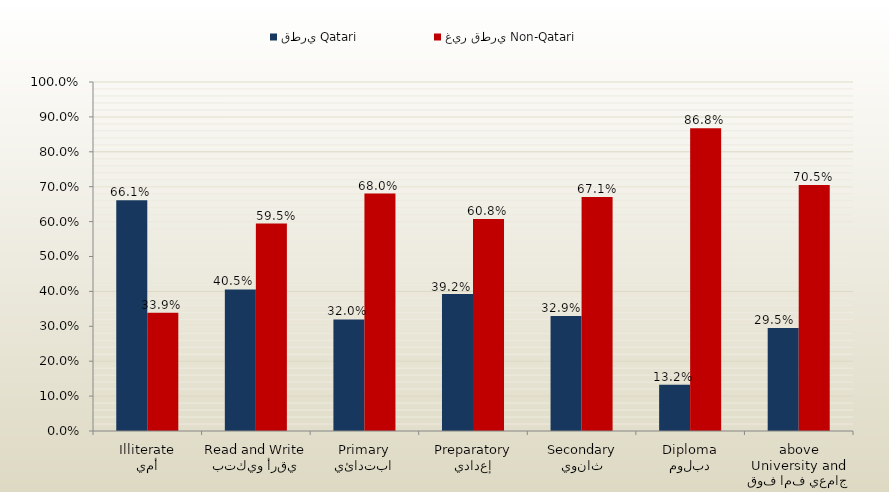
| Category | قطري Qatari | غير قطري Non-Qatari |
|---|---|---|
| أمي
Illiterate | 0.661 | 0.339 |
| يقرأ ويكتب
Read and Write | 0.405 | 0.595 |
| ابتدائي
Primary | 0.32 | 0.68 |
| إعدادي
Preparatory | 0.392 | 0.608 |
| ثانوي
Secondary | 0.329 | 0.671 |
| دبلوم
Diploma | 0.132 | 0.868 |
| جامعي فما فوق
University and above | 0.295 | 0.705 |